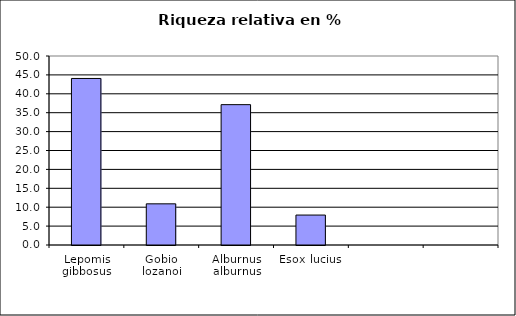
| Category | Series 0 |
|---|---|
| Lepomis gibbosus | 44.059 |
| Gobio lozanoi | 10.891 |
| Alburnus alburnus | 37.129 |
| Esox lucius | 7.921 |